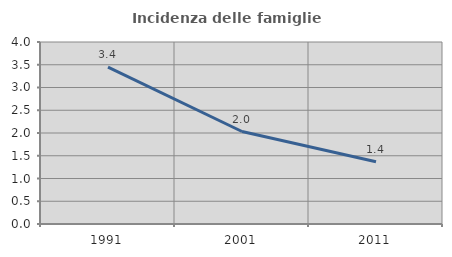
| Category | Incidenza delle famiglie numerose |
|---|---|
| 1991.0 | 3.448 |
| 2001.0 | 2.033 |
| 2011.0 | 1.37 |